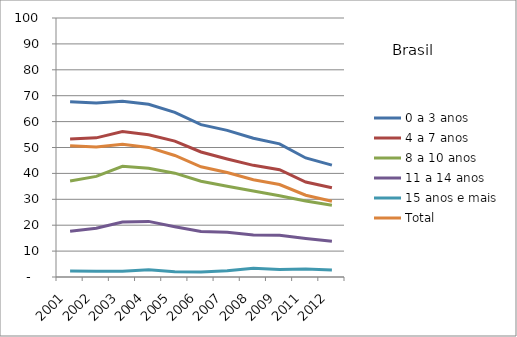
| Category | 0 a 3 anos | 4 a 7 anos | 8 a 10 anos | 11 a 14 anos | 15 anos e mais | Total |
|---|---|---|---|---|---|---|
| 2001.0 | 67.66 | 53.31 | 37.03 | 17.67 | 2.28 | 50.67 |
| 2002.0 | 67.17 | 53.72 | 38.84 | 18.81 | 2.25 | 50.15 |
| 2003.0 | 67.9 | 56.18 | 42.73 | 21.2 | 2.26 | 51.23 |
| 2004.0 | 66.71 | 54.94 | 42 | 21.47 | 2.76 | 50.03 |
| 2005.0 | 63.56 | 52.48 | 40.09 | 19.43 | 2.01 | 46.93 |
| 2006.0 | 58.81 | 48.26 | 36.95 | 17.56 | 1.93 | 42.56 |
| 2007.0 | 56.62 | 45.58 | 35.03 | 17.28 | 2.41 | 40.32 |
| 2008.0 | 53.55 | 43.11 | 33.17 | 16.19 | 3.37 | 37.57 |
| 2009.0 | 51.4 | 41.44 | 31.37 | 16.1 | 2.9 | 35.71 |
| 2011.0 | 45.96 | 36.66 | 29.33 | 14.86 | 3.06 | 31.56 |
| 2012.0 | 43.19 | 34.44 | 27.72 | 13.83 | 2.73 | 29.23 |